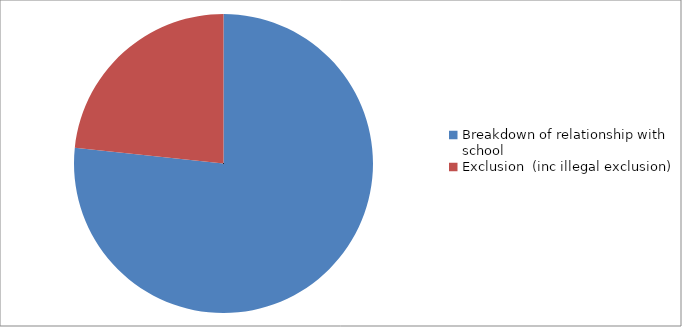
| Category | Series 0 |
|---|---|
| Breakdown of relationship with school | 23 |
| Exclusion  (inc illegal exclusion) | 7 |